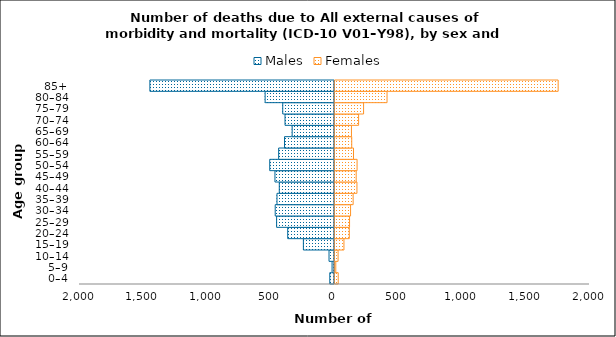
| Category | Males | Females |
|---|---|---|
| 0–4 | -37 | 33 |
| 5–9 | -19 | 14 |
| 10–14 | -43 | 32 |
| 15–19 | -244 | 78 |
| 20–24 | -367 | 120 |
| 25–29 | -454 | 122 |
| 30–34 | -465 | 130 |
| 35–39 | -451 | 150 |
| 40–44 | -433 | 180 |
| 45–49 | -467 | 174 |
| 50–54 | -508 | 181 |
| 55–59 | -438 | 153 |
| 60–64 | -392 | 139 |
| 65–69 | -332 | 137 |
| 70–74 | -388 | 193 |
| 75–79 | -406 | 232 |
| 80–84 | -544 | 416 |
| 85+ | -1448 | 1758 |